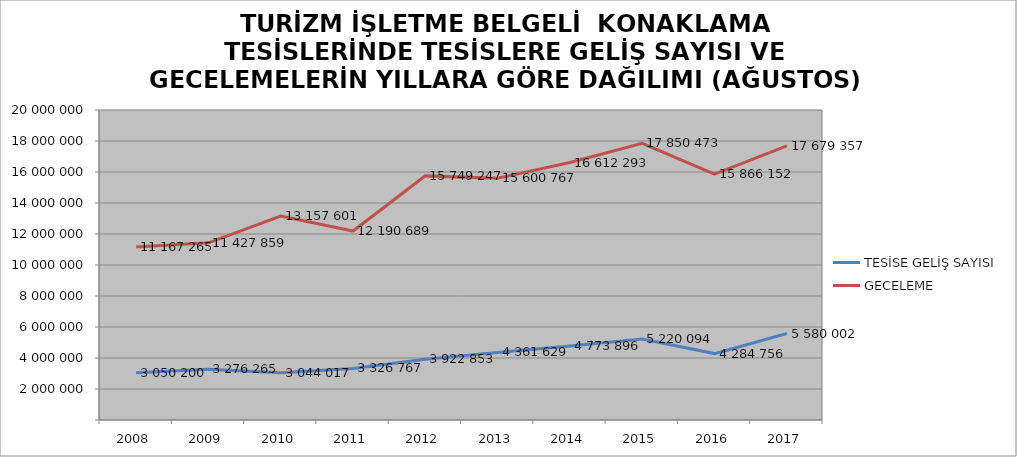
| Category | TESİSE GELİŞ SAYISI | GECELEME |
|---|---|---|
| 2008 | 3050200 | 11167265 |
| 2009 | 3276265 | 11427859 |
| 2010 | 3044017 | 13157601 |
| 2011 | 3326767 | 12190689 |
| 2012 | 3922853 | 15749247 |
| 2013 | 4361629 | 15600767 |
| 2014 | 4773896 | 16612293 |
| 2015 | 5220094 | 17850473 |
| 2016 | 4284756 | 15866152 |
| 2017 | 5580002 | 17679357 |